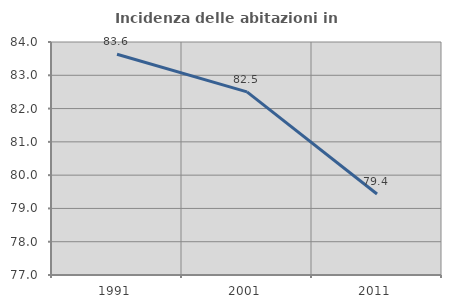
| Category | Incidenza delle abitazioni in proprietà  |
|---|---|
| 1991.0 | 83.634 |
| 2001.0 | 82.503 |
| 2011.0 | 79.435 |